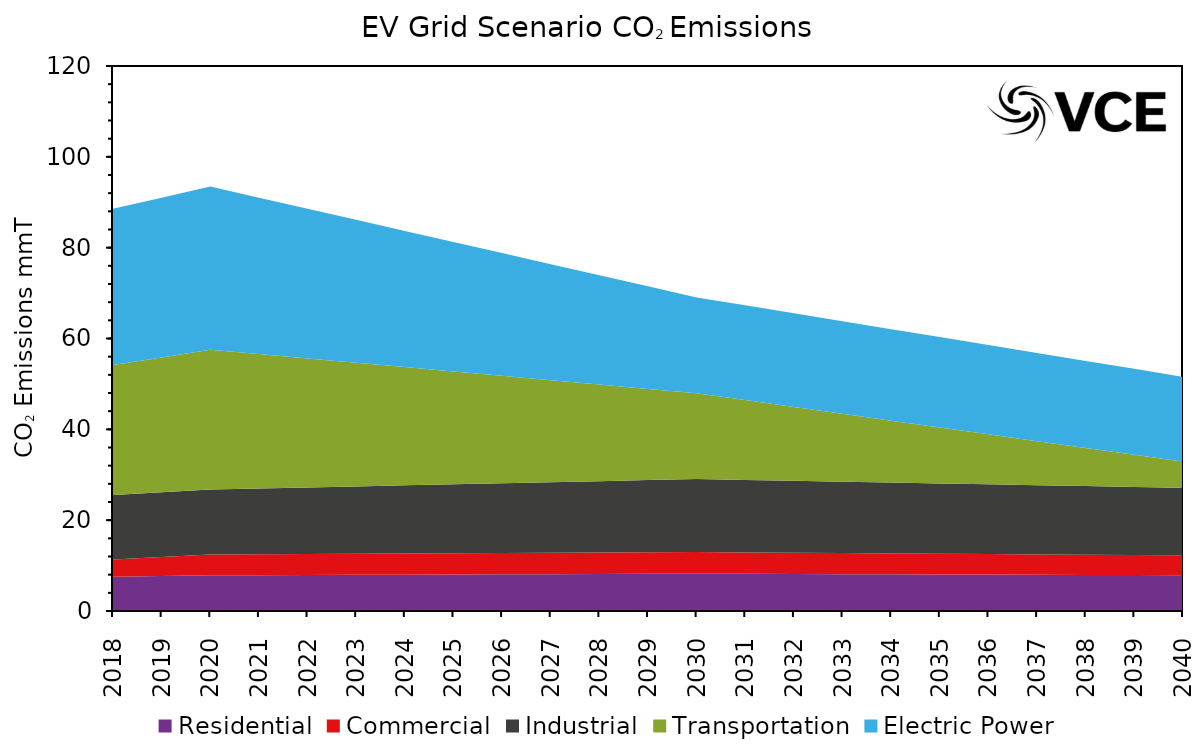
| Category | Residential | Commercial | Industrial | Transportation | Electric Power  |
|---|---|---|---|---|---|
| 2018.0 | 7.535 | 3.793 | 14.212 | 28.599 | 34.44 |
| 2019.0 | 7.697 | 4.197 | 14.241 | 29.705 | 35.17 |
| 2020.0 | 7.86 | 4.6 | 14.27 | 30.811 | 35.9 |
| 2021.0 | 7.896 | 4.615 | 14.452 | 29.617 | 34.421 |
| 2022.0 | 7.932 | 4.63 | 14.634 | 28.424 | 32.942 |
| 2023.0 | 7.968 | 4.645 | 14.816 | 27.231 | 31.463 |
| 2024.0 | 8.004 | 4.66 | 14.998 | 26.038 | 29.984 |
| 2025.0 | 8.04 | 4.675 | 15.18 | 24.845 | 28.505 |
| 2026.0 | 8.076 | 4.69 | 15.362 | 23.652 | 27.026 |
| 2027.0 | 8.112 | 4.705 | 15.544 | 22.459 | 25.547 |
| 2028.0 | 8.148 | 4.72 | 15.726 | 21.266 | 24.068 |
| 2029.0 | 8.184 | 4.735 | 15.908 | 20.073 | 22.589 |
| 2030.0 | 8.22 | 4.75 | 16.09 | 18.88 | 21.11 |
| 2031.0 | 8.185 | 4.713 | 15.967 | 17.568 | 20.868 |
| 2032.0 | 8.15 | 4.676 | 15.844 | 16.257 | 20.626 |
| 2033.0 | 8.115 | 4.639 | 15.721 | 14.946 | 20.384 |
| 2034.0 | 8.08 | 4.602 | 15.598 | 13.634 | 20.142 |
| 2035.0 | 8.045 | 4.565 | 15.475 | 12.323 | 19.9 |
| 2036.0 | 8.01 | 4.528 | 15.352 | 11.011 | 19.658 |
| 2037.0 | 7.975 | 4.491 | 15.229 | 9.7 | 19.416 |
| 2038.0 | 7.94 | 4.454 | 15.106 | 8.388 | 19.174 |
| 2039.0 | 7.905 | 4.417 | 14.983 | 7.077 | 18.932 |
| 2040.0 | 7.87 | 4.38 | 14.86 | 5.765 | 18.69 |